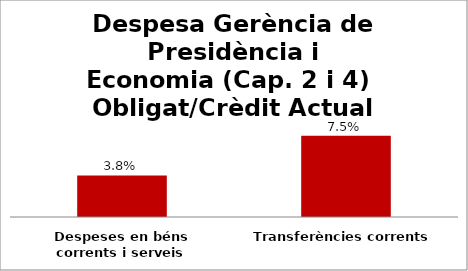
| Category | Series 0 |
|---|---|
| Despeses en béns corrents i serveis | 0.038 |
| Transferències corrents | 0.075 |